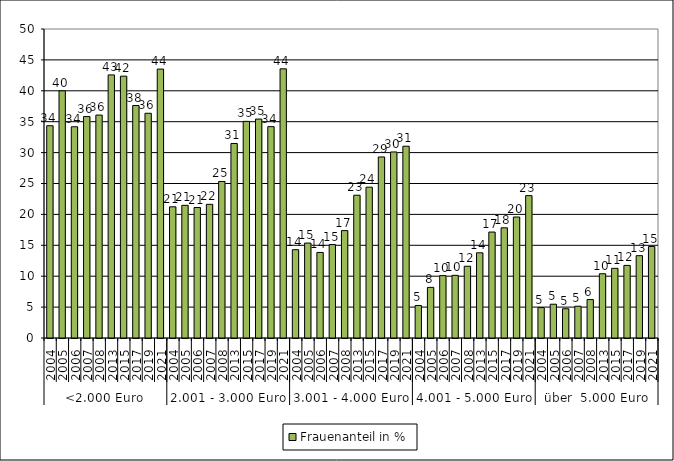
| Category | Frauenanteil in % |
|---|---|
| 0 | 34.346 |
| 1 | 40 |
| 2 | 34.182 |
| 3 | 35.83 |
| 4 | 36.071 |
| 5 | 42.574 |
| 6 | 42.366 |
| 7 | 37.619 |
| 8 | 36.364 |
| 9 | 43.514 |
| 10 | 21.227 |
| 11 | 21.466 |
| 12 | 21.111 |
| 13 | 21.63 |
| 14 | 25.33 |
| 15 | 31.477 |
| 16 | 35.054 |
| 17 | 35.426 |
| 18 | 34.2 |
| 19 | 43.55 |
| 20 | 14.286 |
| 21 | 15.361 |
| 22 | 13.842 |
| 23 | 15.118 |
| 24 | 17.378 |
| 25 | 23.105 |
| 26 | 24.403 |
| 27 | 29.294 |
| 28 | 30.104 |
| 29 | 31.032 |
| 30 | 5.263 |
| 31 | 8.19 |
| 32 | 10.092 |
| 33 | 10.138 |
| 34 | 11.61 |
| 35 | 13.785 |
| 36 | 17.143 |
| 37 | 17.829 |
| 38 | 19.574 |
| 39 | 23.037 |
| 40 | 4.918 |
| 41 | 5.464 |
| 42 | 4.734 |
| 43 | 5.143 |
| 44 | 6.218 |
| 45 | 10.394 |
| 46 | 11.273 |
| 47 | 11.745 |
| 48 | 13.321 |
| 49 | 14.806 |